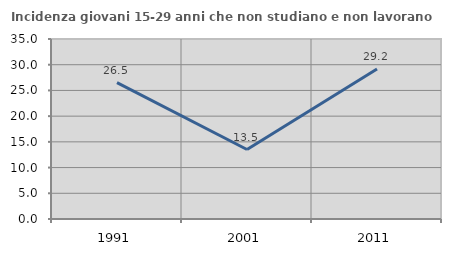
| Category | Incidenza giovani 15-29 anni che non studiano e non lavorano  |
|---|---|
| 1991.0 | 26.506 |
| 2001.0 | 13.514 |
| 2011.0 | 29.167 |